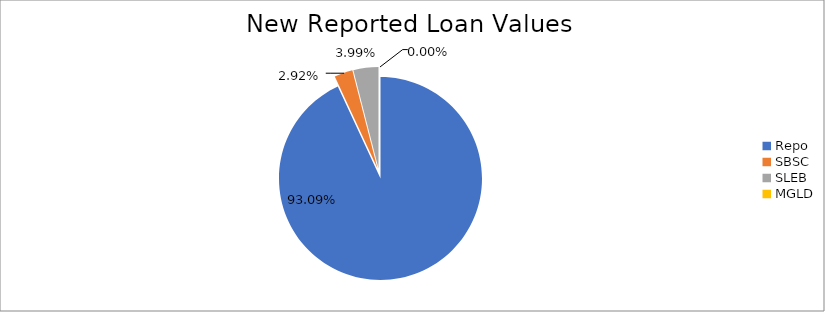
| Category | Series 0 |
|---|---|
| Repo | 8923420.178 |
| SBSC | 280337.319 |
| SLEB | 382119.264 |
| MGLD | 72.506 |